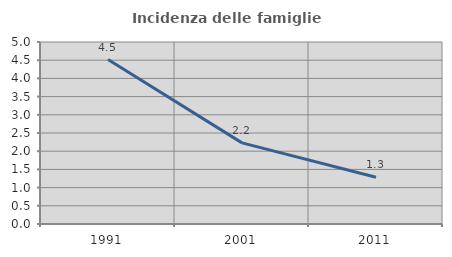
| Category | Incidenza delle famiglie numerose |
|---|---|
| 1991.0 | 4.517 |
| 2001.0 | 2.229 |
| 2011.0 | 1.284 |